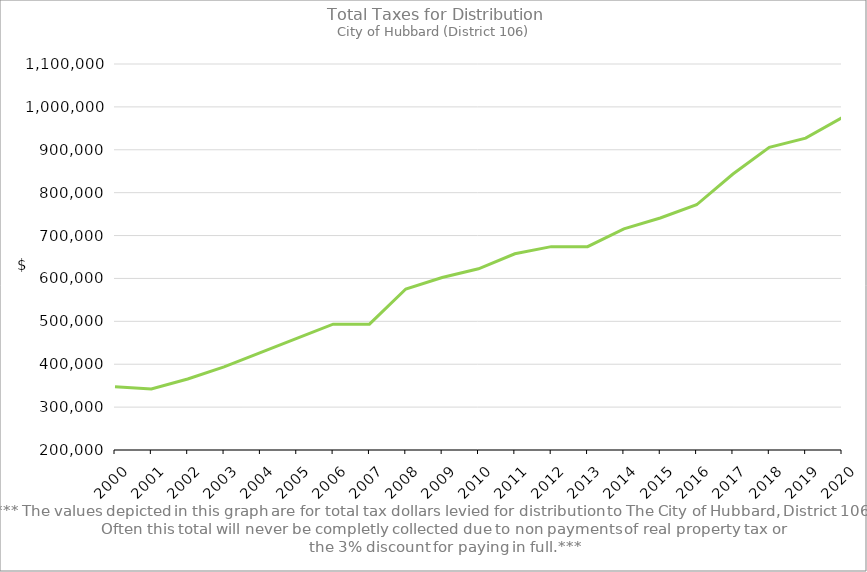
| Category | Series 0 |
|---|---|
| 2000.0 | 347650.45 |
| 2001.0 | 342442.13 |
| 2002.0 | 365606.77 |
| 2003.0 | 393719.35 |
| 2004.0 | 427070.34 |
| 2005.0 | 460380.38 |
| 2006.0 | 493321.62 |
| 2007.0 | 493321.62 |
| 2008.0 | 575343.82 |
| 2009.0 | 602122.07 |
| 2010.0 | 622466.84 |
| 2011.0 | 657528.9 |
| 2012.0 | 674160.31 |
| 2013.0 | 674012.3 |
| 2014.0 | 715740.05 |
| 2015.0 | 741017.9 |
| 2016.0 | 771751.42 |
| 2017.0 | 843550.11 |
| 2018.0 | 905525.97 |
| 2019.0 | 927223.48 |
| 2020.0 | 974959.42 |